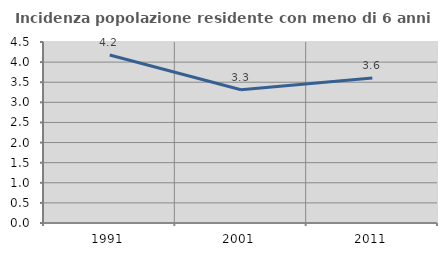
| Category | Incidenza popolazione residente con meno di 6 anni |
|---|---|
| 1991.0 | 4.176 |
| 2001.0 | 3.313 |
| 2011.0 | 3.605 |